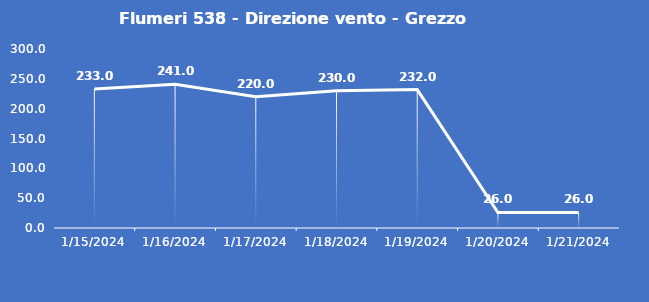
| Category | Flumeri 538 - Direzione vento - Grezzo (°N) |
|---|---|
| 1/15/24 | 233 |
| 1/16/24 | 241 |
| 1/17/24 | 220 |
| 1/18/24 | 230 |
| 1/19/24 | 232 |
| 1/20/24 | 26 |
| 1/21/24 | 26 |